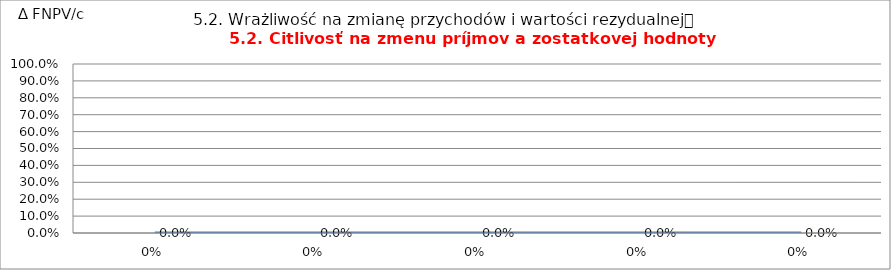
| Category | 5.2. Wrażliwość na zmianę przychodów i wartości rezydualnej
5.2. Citlivosť na zmenu príjmov a zostatkovej hodnoty |
|---|---|
| 0.0 | 0 |
| 0.0 | 0 |
| 0.0 | 0 |
| 0.0 | 0 |
| 0.0 | 0 |